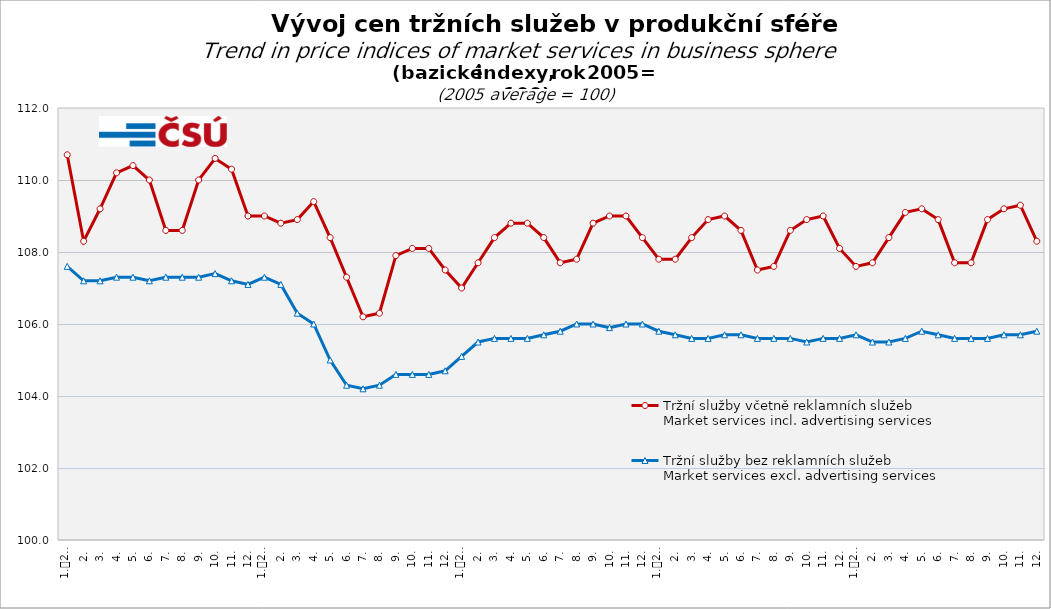
| Category | Tržní služby včetně reklamních služeb
Market services incl. advertising services | Tržní služby bez reklamních služeb
Market services excl. advertising services |
|---|---|---|
| 0 | 110.7 | 107.6 |
| 1 | 108.3 | 107.2 |
| 2 | 109.2 | 107.2 |
| 3 | 110.2 | 107.3 |
| 4 | 110.4 | 107.3 |
| 5 | 110 | 107.2 |
| 6 | 108.6 | 107.3 |
| 7 | 108.6 | 107.3 |
| 8 | 110 | 107.3 |
| 9 | 110.6 | 107.4 |
| 10 | 110.3 | 107.2 |
| 11 | 109 | 107.1 |
| 12 | 109 | 107.3 |
| 13 | 108.8 | 107.1 |
| 14 | 108.9 | 106.3 |
| 15 | 109.4 | 106 |
| 16 | 108.4 | 105 |
| 17 | 107.3 | 104.3 |
| 18 | 106.2 | 104.2 |
| 19 | 106.3 | 104.3 |
| 20 | 107.9 | 104.6 |
| 21 | 108.1 | 104.6 |
| 22 | 108.1 | 104.6 |
| 23 | 107.5 | 104.7 |
| 24 | 107 | 105.1 |
| 25 | 107.7 | 105.5 |
| 26 | 108.4 | 105.6 |
| 27 | 108.8 | 105.6 |
| 28 | 108.8 | 105.6 |
| 29 | 108.4 | 105.7 |
| 30 | 107.7 | 105.8 |
| 31 | 107.8 | 106 |
| 32 | 108.8 | 106 |
| 33 | 109 | 105.9 |
| 34 | 109 | 106 |
| 35 | 108.4 | 106 |
| 36 | 107.8 | 105.8 |
| 37 | 107.8 | 105.7 |
| 38 | 108.4 | 105.6 |
| 39 | 108.9 | 105.6 |
| 40 | 109 | 105.7 |
| 41 | 108.6 | 105.7 |
| 42 | 107.5 | 105.6 |
| 43 | 107.6 | 105.6 |
| 44 | 108.6 | 105.6 |
| 45 | 108.9 | 105.5 |
| 46 | 109 | 105.6 |
| 47 | 108.1 | 105.6 |
| 48 | 107.6 | 105.7 |
| 49 | 107.7 | 105.5 |
| 50 | 108.4 | 105.5 |
| 51 | 109.1 | 105.6 |
| 52 | 109.2 | 105.8 |
| 53 | 108.9 | 105.7 |
| 54 | 107.7 | 105.6 |
| 55 | 107.7 | 105.6 |
| 56 | 108.9 | 105.6 |
| 57 | 109.2 | 105.7 |
| 58 | 109.3 | 105.7 |
| 59 | 108.3 | 105.8 |